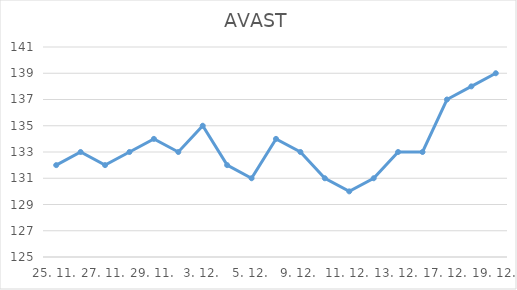
| Category | AVAST |
|---|---|
| 25. 11. | 132 |
| 26. 11. | 133 |
| 27. 11. | 132 |
| 28. 11. | 133 |
| 29. 11. | 134 |
| 2. 12. | 133 |
| 3. 12. | 135 |
| 4. 12. | 132 |
| 5. 12. | 131 |
| 6. 12. | 134 |
| 9. 12. | 133 |
| 10. 12. | 131 |
| 11. 12. | 130 |
| 12. 12. | 131 |
| 13. 12. | 133 |
| 16. 12. | 133 |
| 17. 12. | 137 |
| 18. 12. | 138 |
| 19. 12. | 139 |